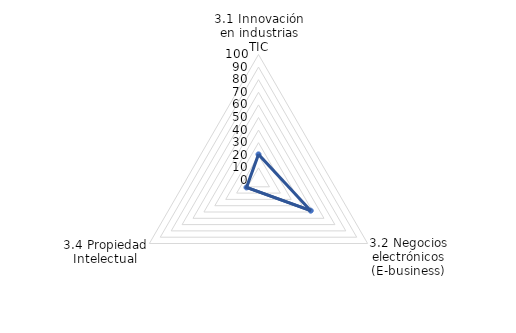
| Category | NACIONAL |
|---|---|
| 3.1 Innovación en industrias TIC | 20.738 |
| 3.2 Negocios electrónicos (E-business) | 47.884 |
| 3.4 Propiedad Intelectual | 11 |